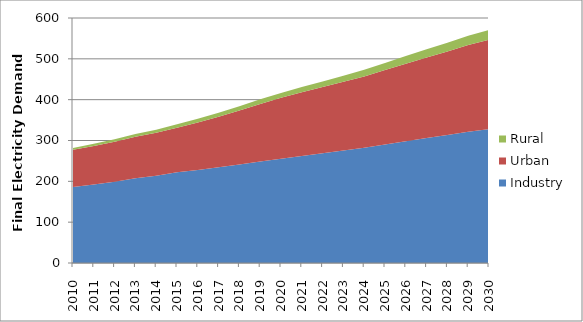
| Category | Industry | Urban | Rural |
|---|---|---|---|
| 2010.0 | 186.126 | 90.917 | 4.58 |
| 2011.0 | 192.436 | 94.192 | 5.223 |
| 2012.0 | 199.234 | 97.635 | 5.915 |
| 2013.0 | 207.309 | 101.695 | 6.686 |
| 2014.0 | 213.753 | 105.007 | 7.449 |
| 2015.0 | 222.331 | 109.186 | 8.325 |
| 2016.0 | 228.04 | 116.203 | 8.933 |
| 2017.0 | 234.461 | 123.972 | 9.612 |
| 2018.0 | 241.401 | 132.15 | 10.352 |
| 2019.0 | 248.831 | 140.863 | 11.156 |
| 2020.0 | 255.253 | 149.273 | 11.964 |
| 2021.0 | 262.297 | 155.607 | 12.975 |
| 2022.0 | 268.912 | 161.803 | 14.01 |
| 2023.0 | 275.501 | 168.124 | 15.079 |
| 2024.0 | 282.275 | 174.652 | 16.195 |
| 2025.0 | 290.405 | 182.139 | 17.421 |
| 2026.0 | 298.464 | 189.735 | 18.69 |
| 2027.0 | 306.044 | 197.147 | 19.973 |
| 2028.0 | 313.561 | 204.636 | 21.293 |
| 2029.0 | 321.31 | 212.394 | 22.671 |
| 2030.0 | 327.656 | 219.314 | 23.986 |